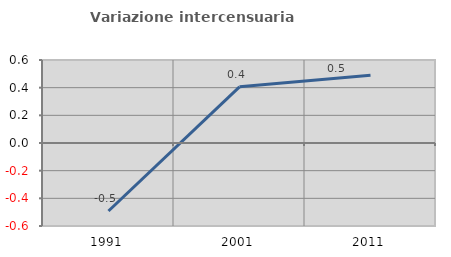
| Category | Variazione intercensuaria annua |
|---|---|
| 1991.0 | -0.492 |
| 2001.0 | 0.406 |
| 2011.0 | 0.489 |